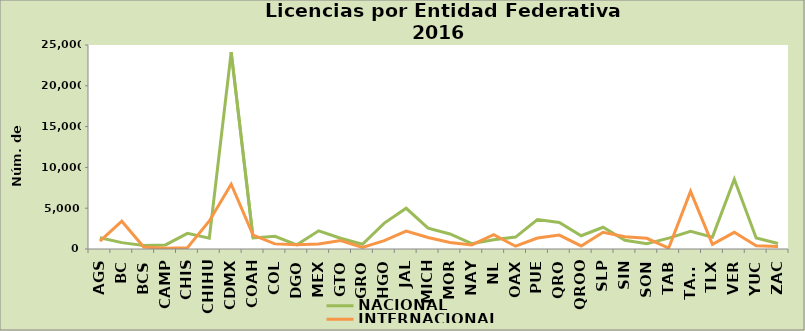
| Category | NACIONAL | INTERNACIONAL |
|---|---|---|
| AGS | 1386 | 957 |
| BC | 782 | 3399 |
| BCS | 429 | 248 |
| CAMP | 499 | 80 |
| CHIS | 1912 | 160 |
| CHIHU | 1323 | 3440 |
| CDMX | 24134 | 7937 |
| COAH | 1359 | 1708 |
| COL | 1551 | 627 |
| DGO | 506 | 509 |
| MEX | 2228 | 602 |
| GTO | 1322 | 1037 |
| GRO | 580 | 204 |
| HGO | 3178 | 1017 |
| JAL | 4992 | 2205 |
| MICH | 2560 | 1412 |
| MOR | 1845 | 799 |
| NAY | 649 | 502 |
| NL | 1130 | 1758 |
| OAX | 1460 | 340 |
| PUE | 3617 | 1348 |
| QRO | 3251 | 1700 |
| QROO | 1627 | 373 |
| SLP | 2668 | 2048 |
| SIN | 1062 | 1508 |
| SON | 634 | 1306 |
| TAB | 1327 | 112 |
| TAMS | 2160 | 7059 |
| TLX | 1457 | 563 |
| VER | 8542 | 2043 |
| YUC | 1352 | 405 |
| ZAC | 672 | 315 |